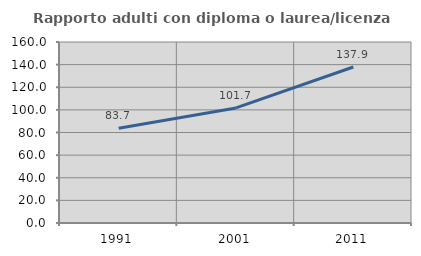
| Category | Rapporto adulti con diploma o laurea/licenza media  |
|---|---|
| 1991.0 | 83.68 |
| 2001.0 | 101.706 |
| 2011.0 | 137.866 |